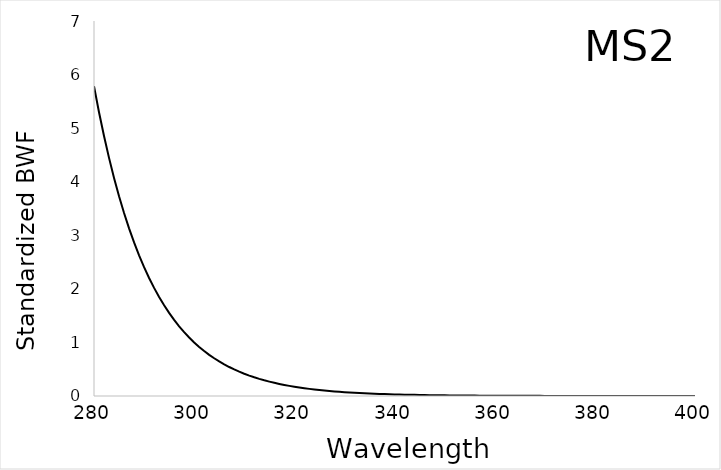
| Category | BWF |
|---|---|
| 280.0 | 5.784 |
| 281.0 | 5.298 |
| 282.0 | 4.853 |
| 283.0 | 4.445 |
| 284.0 | 4.072 |
| 285.0 | 3.729 |
| 286.0 | 3.416 |
| 287.0 | 3.129 |
| 288.0 | 2.866 |
| 289.0 | 2.625 |
| 290.0 | 2.405 |
| 291.0 | 2.203 |
| 292.0 | 2.018 |
| 293.0 | 1.848 |
| 294.0 | 1.693 |
| 295.0 | 1.551 |
| 296.0 | 1.42 |
| 297.0 | 1.301 |
| 298.0 | 1.192 |
| 299.0 | 1.092 |
| 300.0 | 1 |
| 301.0 | 0.916 |
| 302.0 | 0.839 |
| 303.0 | 0.769 |
| 304.0 | 0.704 |
| 305.0 | 0.645 |
| 306.0 | 0.591 |
| 307.0 | 0.541 |
| 308.0 | 0.496 |
| 309.0 | 0.454 |
| 310.0 | 0.416 |
| 311.0 | 0.381 |
| 312.0 | 0.349 |
| 313.0 | 0.32 |
| 314.0 | 0.293 |
| 315.0 | 0.268 |
| 316.0 | 0.246 |
| 317.0 | 0.225 |
| 318.0 | 0.206 |
| 319.0 | 0.189 |
| 320.0 | 0.173 |
| 321.0 | 0.158 |
| 322.0 | 0.145 |
| 323.0 | 0.133 |
| 324.0 | 0.122 |
| 325.0 | 0.111 |
| 326.0 | 0.102 |
| 327.0 | 0.094 |
| 328.0 | 0.086 |
| 329.0 | 0.078 |
| 330.0 | 0.072 |
| 331.0 | 0.066 |
| 332.0 | 0.06 |
| 333.0 | 0.055 |
| 334.0 | 0.051 |
| 335.0 | 0.046 |
| 336.0 | 0.042 |
| 337.0 | 0.039 |
| 338.0 | 0.036 |
| 339.0 | 0.033 |
| 340.0 | 0.03 |
| 341.0 | 0.027 |
| 342.0 | 0.025 |
| 343.0 | 0.023 |
| 344.0 | 0.021 |
| 345.0 | 0.019 |
| 346.0 | 0.018 |
| 347.0 | 0.016 |
| 348.0 | 0.015 |
| 349.0 | 0.014 |
| 350.0 | 0.012 |
| 351.0 | 0.011 |
| 352.0 | 0.01 |
| 353.0 | 0.01 |
| 354.0 | 0.009 |
| 355.0 | 0.008 |
| 356.0 | 0.007 |
| 357.0 | 0.007 |
| 358.0 | 0.006 |
| 359.0 | 0.006 |
| 360.0 | 0.005 |
| 361.0 | 0.005 |
| 362.0 | 0.004 |
| 363.0 | 0.004 |
| 364.0 | 0.004 |
| 365.0 | 0.003 |
| 366.0 | 0.003 |
| 367.0 | 0.003 |
| 368.0 | 0.003 |
| 369.0 | 0.002 |
| 370.0 | 0.002 |
| 371.0 | 0.002 |
| 372.0 | 0.002 |
| 373.0 | 0.002 |
| 374.0 | 0.002 |
| 375.0 | 0.001 |
| 376.0 | 0.001 |
| 377.0 | 0.001 |
| 378.0 | 0.001 |
| 379.0 | 0.001 |
| 380.0 | 0.001 |
| 381.0 | 0.001 |
| 382.0 | 0.001 |
| 383.0 | 0.001 |
| 384.0 | 0.001 |
| 385.0 | 0.001 |
| 386.0 | 0.001 |
| 387.0 | 0 |
| 388.0 | 0 |
| 389.0 | 0 |
| 390.0 | 0 |
| 391.0 | 0 |
| 392.0 | 0 |
| 393.0 | 0 |
| 394.0 | 0 |
| 395.0 | 0 |
| 396.0 | 0 |
| 397.0 | 0 |
| 398.0 | 0 |
| 399.0 | 0 |
| 400.0 | 0 |
| 401.0 | 0 |
| 402.0 | 0 |
| 403.0 | 0 |
| 404.0 | 0 |
| 405.0 | 0 |
| 406.0 | 0 |
| 407.0 | 0 |
| 408.0 | 0 |
| 409.0 | 0 |
| 410.0 | 0 |
| 411.0 | 0 |
| 412.0 | 0 |
| 413.0 | 0 |
| 414.0 | 0 |
| 415.0 | 0 |
| 416.0 | 0 |
| 417.0 | 0 |
| 418.0 | 0 |
| 419.0 | 0 |
| 420.0 | 0 |
| 421.0 | 0 |
| 422.0 | 0 |
| 423.0 | 0 |
| 424.0 | 0 |
| 425.0 | 0 |
| 426.0 | 0 |
| 427.0 | 0 |
| 428.0 | 0 |
| 429.0 | 0 |
| 430.0 | 0 |
| 431.0 | 0 |
| 432.0 | 0 |
| 433.0 | 0 |
| 434.0 | 0 |
| 435.0 | 0 |
| 436.0 | 0 |
| 437.0 | 0 |
| 438.0 | 0 |
| 439.0 | 0 |
| 440.0 | 0 |
| 441.0 | 0 |
| 442.0 | 0 |
| 443.0 | 0 |
| 444.0 | 0 |
| 445.0 | 0 |
| 446.0 | 0 |
| 447.0 | 0 |
| 448.0 | 0 |
| 449.0 | 0 |
| 450.0 | 0 |
| 451.0 | 0 |
| 452.0 | 0 |
| 453.0 | 0 |
| 454.0 | 0 |
| 455.0 | 0 |
| 456.0 | 0 |
| 457.0 | 0 |
| 458.0 | 0 |
| 459.0 | 0 |
| 460.0 | 0 |
| 461.0 | 0 |
| 462.0 | 0 |
| 463.0 | 0 |
| 464.0 | 0 |
| 465.0 | 0 |
| 466.0 | 0 |
| 467.0 | 0 |
| 468.0 | 0 |
| 469.0 | 0 |
| 470.0 | 0 |
| 471.0 | 0 |
| 472.0 | 0 |
| 473.0 | 0 |
| 474.0 | 0 |
| 475.0 | 0 |
| 476.0 | 0 |
| 477.0 | 0 |
| 478.0 | 0 |
| 479.0 | 0 |
| 480.0 | 0 |
| 481.0 | 0 |
| 482.0 | 0 |
| 483.0 | 0 |
| 484.0 | 0 |
| 485.0 | 0 |
| 486.0 | 0 |
| 487.0 | 0 |
| 488.0 | 0 |
| 489.0 | 0 |
| 490.0 | 0 |
| 491.0 | 0 |
| 492.0 | 0 |
| 493.0 | 0 |
| 494.0 | 0 |
| 495.0 | 0 |
| 496.0 | 0 |
| 497.0 | 0 |
| 498.0 | 0 |
| 499.0 | 0 |
| 500.0 | 0 |